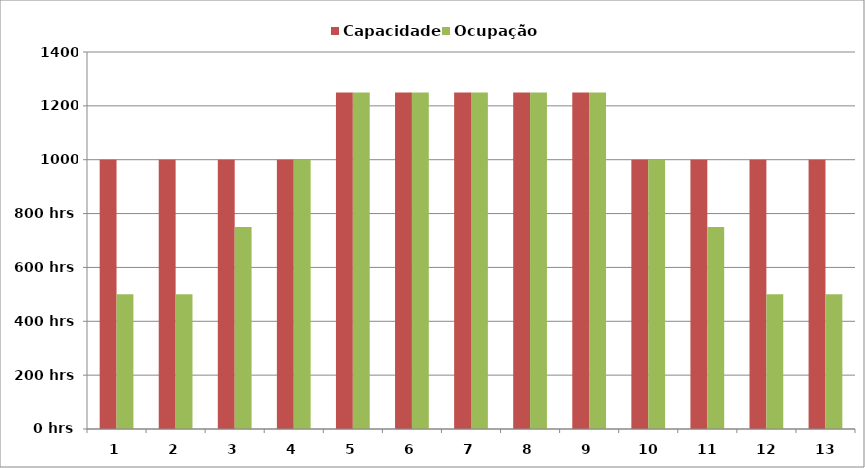
| Category | Capacidade | Ocupação |
|---|---|---|
| 1.0 | 1000 | 500 |
| 2.0 | 1000 | 500 |
| 3.0 | 1000 | 750 |
| 4.0 | 1000 | 1000 |
| 5.0 | 1250 | 1250 |
| 6.0 | 1250 | 1250 |
| 7.0 | 1250 | 1250 |
| 8.0 | 1250 | 1250 |
| 9.0 | 1250 | 1250 |
| 10.0 | 1000 | 1000 |
| 11.0 | 1000 | 750 |
| 12.0 | 1000 | 500 |
| 13.0 | 1000 | 500 |